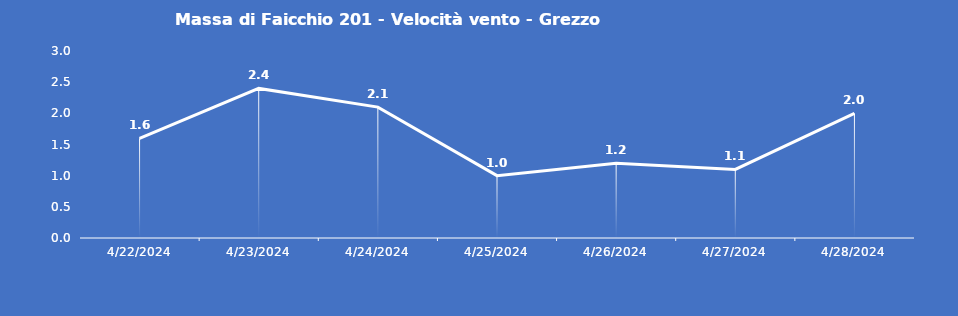
| Category | Massa di Faicchio 201 - Velocità vento - Grezzo (m/s) |
|---|---|
| 4/22/24 | 1.6 |
| 4/23/24 | 2.4 |
| 4/24/24 | 2.1 |
| 4/25/24 | 1 |
| 4/26/24 | 1.2 |
| 4/27/24 | 1.1 |
| 4/28/24 | 2 |